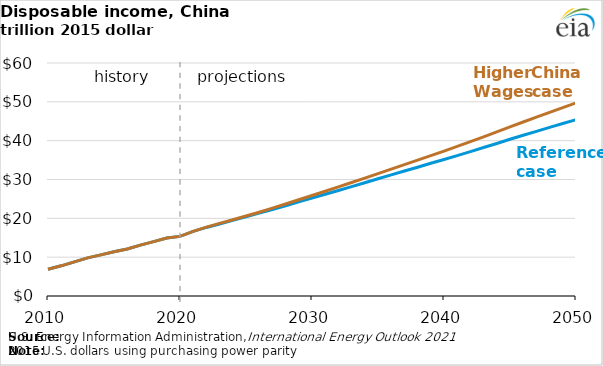
| Category | Reference case | Higher China Wages case |
|---|---|---|
| 2010.0 | 6888.763 | 6888.763 |
| 2011.0 | 7772.774 | 7772.774 |
| 2012.0 | 8795.766 | 8795.766 |
| 2013.0 | 9809.154 | 9809.154 |
| 2014.0 | 10595.13 | 10595.13 |
| 2015.0 | 11372.69 | 11372.69 |
| 2016.0 | 12100.7 | 12100.7 |
| 2017.0 | 13100.36 | 13100.36 |
| 2018.0 | 13992.17 | 13992.17 |
| 2019.0 | 14936.15 | 14936.15 |
| 2020.0 | 15345.75 | 15345.75 |
| 2021.0 | 16645.52 | 16650.18 |
| 2022.0 | 17658.1 | 17751.49 |
| 2023.0 | 18557.07 | 18689.06 |
| 2024.0 | 19464.93 | 19617.14 |
| 2025.0 | 20392.21 | 20585.82 |
| 2026.0 | 21328.96 | 21580.13 |
| 2027.0 | 22290.53 | 22624.43 |
| 2028.0 | 23256.77 | 23693.23 |
| 2029.0 | 24231.89 | 24782.14 |
| 2030.0 | 25200.32 | 25869.24 |
| 2031.0 | 26188.64 | 26980.24 |
| 2032.0 | 27174.64 | 28088.98 |
| 2033.0 | 28179.99 | 29222.86 |
| 2034.0 | 29176.44 | 30358.05 |
| 2035.0 | 30184.73 | 31514.36 |
| 2036.0 | 31185.36 | 32669.34 |
| 2037.0 | 32179.58 | 33821.18 |
| 2038.0 | 33167.34 | 34974.39 |
| 2039.0 | 34175.38 | 36159.74 |
| 2040.0 | 35147.17 | 37312.61 |
| 2041.0 | 36151.23 | 38508.64 |
| 2042.0 | 37189.3 | 39750.82 |
| 2043.0 | 38225.39 | 40992.63 |
| 2044.0 | 39284.91 | 42267.36 |
| 2045.0 | 40367.02 | 43572.15 |
| 2046.0 | 41390.39 | 44814.66 |
| 2047.0 | 42403.85 | 46051.63 |
| 2048.0 | 43423.56 | 47300.38 |
| 2049.0 | 44422.89 | 48525.59 |
| 2050.0 | 45400.18 | 49718.35 |